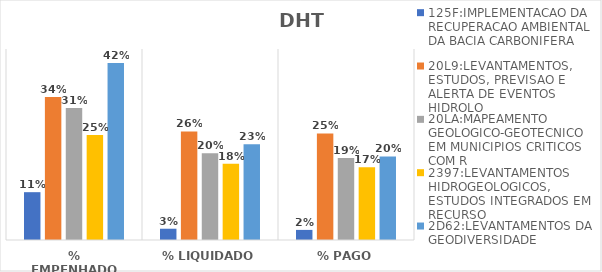
| Category | 125F:IMPLEMENTACAO DA RECUPERACAO AMBIENTAL DA BACIA CARBONIFERA | 20L9:LEVANTAMENTOS, ESTUDOS, PREVISAO E ALERTA DE EVENTOS HIDROLO | 20LA:MAPEAMENTO GEOLOGICO-GEOTECNICO EM MUNICIPIOS CRITICOS COM R | 2397:LEVANTAMENTOS HIDROGEOLOGICOS, ESTUDOS INTEGRADOS EM RECURSO | 2D62:LEVANTAMENTOS DA GEODIVERSIDADE |
|---|---|---|---|---|---|
| % EMPENHADO | 0.113 | 0.337 | 0.311 | 0.247 | 0.417 |
| % LIQUIDADO | 0.027 | 0.256 | 0.204 | 0.18 | 0.225 |
| % PAGO | 0.024 | 0.251 | 0.193 | 0.171 | 0.197 |